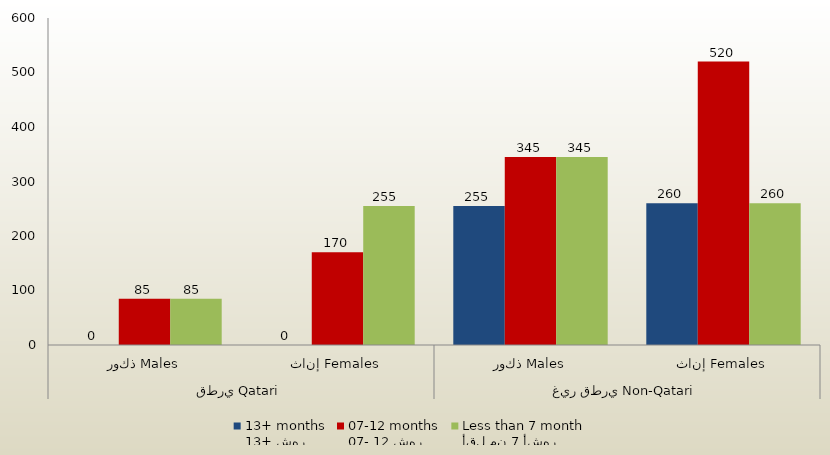
| Category | 13+ شهر
13+ months | 07- 12 شهر
07-12 months | أقل من 7 أشهر
Less than 7 month  |
|---|---|---|---|
| 0 | 0 | 85 | 85 |
| 1 | 0 | 170 | 255 |
| 2 | 255 | 345 | 345 |
| 3 | 260 | 520 | 260 |